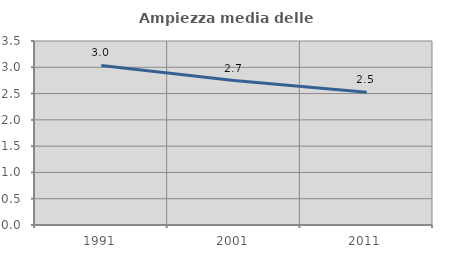
| Category | Ampiezza media delle famiglie |
|---|---|
| 1991.0 | 3.036 |
| 2001.0 | 2.746 |
| 2011.0 | 2.527 |